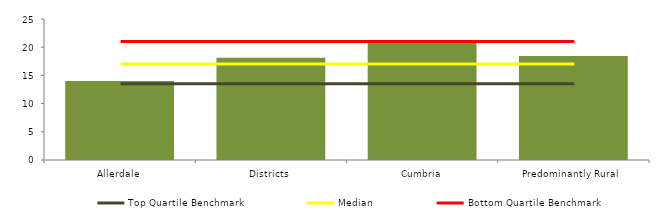
| Category | Block Data |
|---|---|
| Allerdale | 14 |
| Districts | 18.151 |
| Cumbria | 21 |
|  Predominantly Rural   | 18.431 |